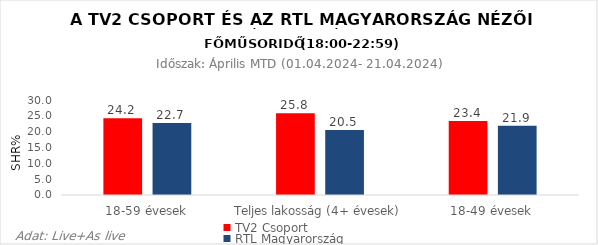
| Category | TV2 Csoport | RTL Magyarország |
|---|---|---|
| 18-59 évesek | 24.2 | 22.7 |
| Teljes lakosság (4+ évesek) | 25.8 | 20.5 |
| 18-49 évesek | 23.4 | 21.9 |